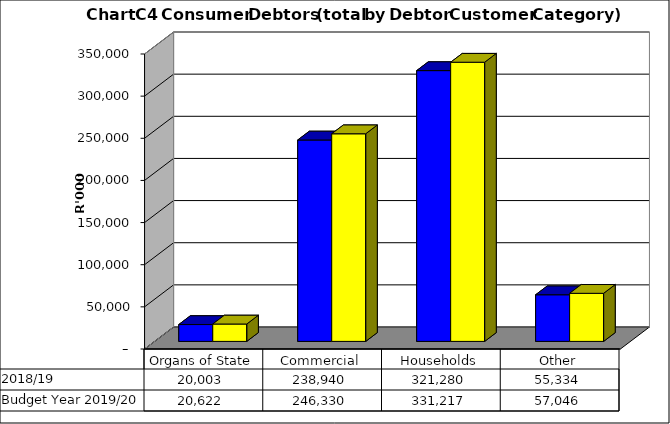
| Category |  2018/19  | Budget Year 2019/20 |
|---|---|---|
| Organs of State | 20003433.964 | 20622096.87 |
| Commercial | 238940178.968 | 246330081.41 |
| Households | 321280173.421 | 331216673.63 |
| Other | 55334147.959 | 57045513.36 |